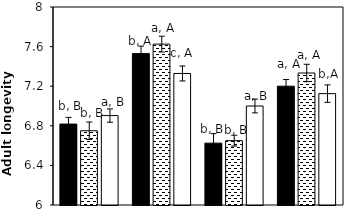
| Category | AB | AC | CK |
|---|---|---|---|
| aCO2-Bt | 6.818 | 6.75 | 6.903 |
| aCO2-Xy | 7.529 | 7.625 | 7.329 |
| eCO2-Bt | 6.625 | 6.65 | 7 |
| eCO2-Xy | 7.2 | 7.333 | 7.125 |